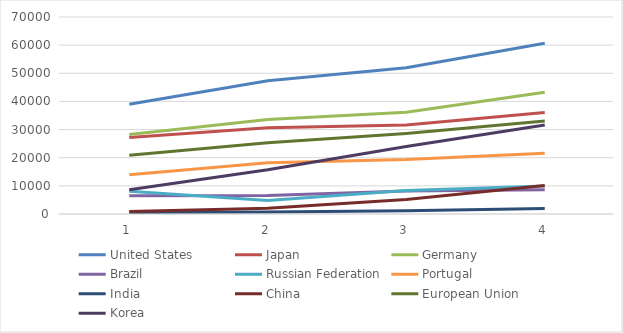
| Category | United States | Japan | Germany | Brazil | Russian Federation | Portugal | India | China | European Union | Korea |
|---|---|---|---|---|---|---|---|---|---|---|
| 0 | 39014.204 | 27199.94 | 28256.106 | 6479.077 | 8105.888 | 13987.965 | 517.42 | 883.763 | 20898.837 | 8608 |
| 1 | 47360.536 | 30636.266 | 33559.399 | 6551.235 | 4819.376 | 18231.84 | 740.916 | 2038.203 | 25275.402 | 15712 |
| 2 | 51996.183 | 31651.084 | 36190.393 | 8142.771 | 8381.861 | 19343.28 | 1156.88 | 5128.895 | 28613.182 | 23948 |
| 3 | 60698.011 | 36081.065 | 43284.602 | 8592.222 | 9958.461 | 21617.412 | 1941.815 | 10155.493 | 33011.437 | 31640 |